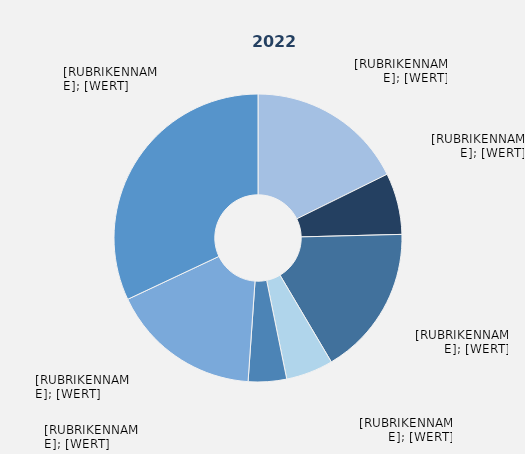
| Category | Series 1 |
|---|---|
| Produzierendes Gewerbe ohne Baugewerbe² | 17.7 |
| Baugewerbe | 6.9 |
| Handel | 16.9 |
| Verkehr und Lagerei | 5.3 |
| Gastgewerbe | 4.3 |
| Erbringung von Unternehmens-dienstleistungen | 16.9 |
| Erbringung von öffentlichen und privaten Dienstleistungen | 32 |